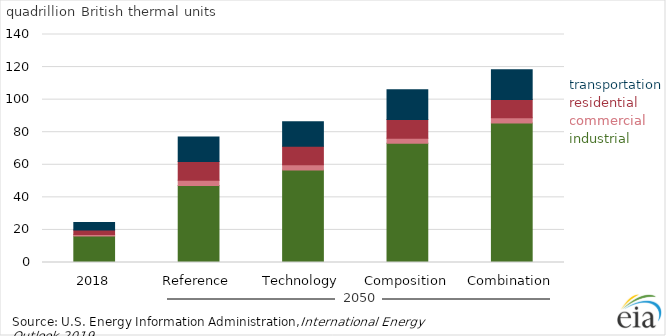
| Category | Industrial | Commercial | Residential | Transportation |
|---|---|---|---|---|
| 2018 | 16.336 | 0.884 | 2.73 | 4.681 |
| Reference | 47.336 | 3.203 | 11.509 | 15.009 |
| Technology | 56.86 | 3.19 | 11.338 | 14.962 |
| Composition | 73.193 | 3.152 | 11.453 | 18.28 |
| Combination | 85.682 | 3.139 | 11.308 | 18.247 |